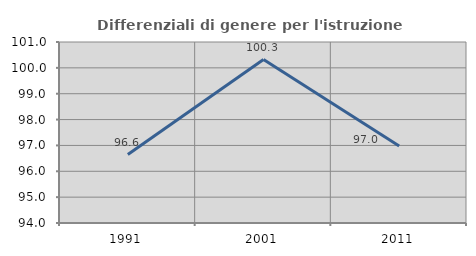
| Category | Differenziali di genere per l'istruzione superiore |
|---|---|
| 1991.0 | 96.649 |
| 2001.0 | 100.322 |
| 2011.0 | 96.978 |